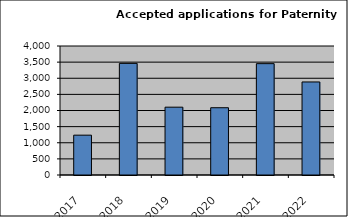
| Category | Series 0 |
|---|---|
| 2017.0 | 1235 |
| 2018.0 | 3461 |
| 2019.0 | 2103 |
| 2020.0 | 2086 |
| 2021.0 | 3453 |
| 2022.0 | 2885 |